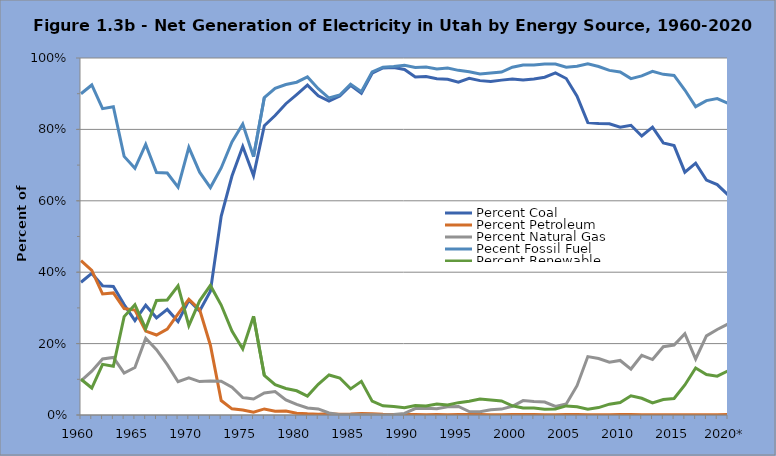
| Category | Percent Coal | Percent Petroleum | Percent Natural Gas | Pecent Fossil Fuel | Percent Renewable |
|---|---|---|---|---|---|
| 1960 | 0.372 | 0.432 | 0.095 | 0.9 | 0.1 |
| 1961 | 0.397 | 0.405 | 0.123 | 0.924 | 0.076 |
| 1962 | 0.362 | 0.339 | 0.157 | 0.858 | 0.142 |
| 1963 | 0.36 | 0.342 | 0.161 | 0.863 | 0.137 |
| 1964 | 0.309 | 0.298 | 0.117 | 0.724 | 0.276 |
| 1965 | 0.264 | 0.294 | 0.133 | 0.691 | 0.309 |
| 1966 | 0.308 | 0.235 | 0.215 | 0.758 | 0.242 |
| 1967 | 0.272 | 0.224 | 0.183 | 0.679 | 0.321 |
| 1968 | 0.296 | 0.241 | 0.141 | 0.678 | 0.322 |
| 1969 | 0.262 | 0.283 | 0.093 | 0.638 | 0.362 |
| 1970 | 0.321 | 0.324 | 0.104 | 0.75 | 0.25 |
| 1971 | 0.291 | 0.295 | 0.094 | 0.68 | 0.32 |
| 1972 | 0.347 | 0.195 | 0.095 | 0.637 | 0.363 |
| 1973 | 0.557 | 0.04 | 0.095 | 0.692 | 0.308 |
| 1974 | 0.669 | 0.017 | 0.078 | 0.765 | 0.235 |
| 1975 | 0.752 | 0.014 | 0.049 | 0.815 | 0.185 |
| 1976 | 0.671 | 0.008 | 0.045 | 0.723 | 0.277 |
| 1977 | 0.81 | 0.017 | 0.062 | 0.889 | 0.111 |
| 1978 | 0.839 | 0.01 | 0.065 | 0.915 | 0.085 |
| 1979 | 0.872 | 0.011 | 0.042 | 0.926 | 0.074 |
| 1980 | 0.897 | 0.005 | 0.03 | 0.932 | 0.068 |
| 1981 | 0.924 | 0.003 | 0.02 | 0.947 | 0.053 |
| 1982 | 0.894 | 0.002 | 0.017 | 0.914 | 0.086 |
| 1983 | 0.879 | 0.003 | 0.006 | 0.888 | 0.112 |
| 1984 | 0.894 | 0.002 | 0.001 | 0.896 | 0.104 |
| 1985 | 0.923 | 0.003 | 0.001 | 0.927 | 0.073 |
| 1986 | 0.901 | 0.004 | 0 | 0.906 | 0.094 |
| 1987 | 0.957 | 0.003 | 0 | 0.961 | 0.039 |
| 1988 | 0.972 | 0.002 | 0 | 0.974 | 0.026 |
| 1989 | 0.973 | 0.002 | 0.001 | 0.976 | 0.024 |
| 1990 | 0.968 | 0.002 | 0.004 | 0.98 | 0.02 |
| 1991 | 0.947 | 0.002 | 0.018 | 0.973 | 0.027 |
| 1992 | 0.948 | 0.001 | 0.019 | 0.975 | 0.025 |
| 1993 | 0.942 | 0.001 | 0.018 | 0.969 | 0.031 |
| 1994 | 0.94 | 0.001 | 0.023 | 0.972 | 0.028 |
| 1995 | 0.932 | 0.001 | 0.024 | 0.965 | 0.035 |
| 1996 | 0.943 | 0.001 | 0.01 | 0.961 | 0.039 |
| 1997 | 0.937 | 0.001 | 0.009 | 0.955 | 0.045 |
| 1998 | 0.934 | 0.001 | 0.015 | 0.958 | 0.042 |
| 1999 | 0.938 | 0.001 | 0.017 | 0.961 | 0.039 |
| 2000 | 0.941 | 0.002 | 0.024 | 0.974 | 0.026 |
| 2001 | 0.938 | 0.002 | 0.04 | 0.98 | 0.02 |
| 2002 | 0.941 | 0.001 | 0.038 | 0.98 | 0.019 |
| 2003 | 0.946 | 0.001 | 0.036 | 0.983 | 0.016 |
| 2004 | 0.958 | 0.001 | 0.024 | 0.983 | 0.017 |
| 2005 | 0.942 | 0.001 | 0.031 | 0.974 | 0.026 |
| 2006 | 0.893 | 0.002 | 0.082 | 0.977 | 0.023 |
| 2007 | 0.819 | 0.001 | 0.164 | 0.984 | 0.016 |
| 2008 | 0.816 | 0.001 | 0.158 | 0.976 | 0.021 |
| 2009 | 0.816 | 0.001 | 0.148 | 0.965 | 0.03 |
| 2010 | 0.806 | 0.001 | 0.153 | 0.961 | 0.035 |
| 2011 | 0.811 | 0.001 | 0.129 | 0.942 | 0.054 |
| 2012 | 0.782 | 0.001 | 0.167 | 0.95 | 0.047 |
| 2013 | 0.806 | 0.001 | 0.155 | 0.962 | 0.034 |
| 2014 | 0.762 | 0.001 | 0.191 | 0.954 | 0.043 |
| 2015 | 0.755 | 0 | 0.196 | 0.951 | 0.046 |
| 2016 | 0.68 | 0.001 | 0.228 | 0.91 | 0.084 |
| 2017 | 0.705 | 0.001 | 0.157 | 0.864 | 0.132 |
| 2018 | 0.658 | 0.001 | 0.222 | 0.881 | 0.114 |
| 2019 | 0.645 | 0.001 | 0.24 | 0.886 | 0.109 |
| 2020* | 0.617 | 0.001 | 0.255 | 0.873 | 0.124 |